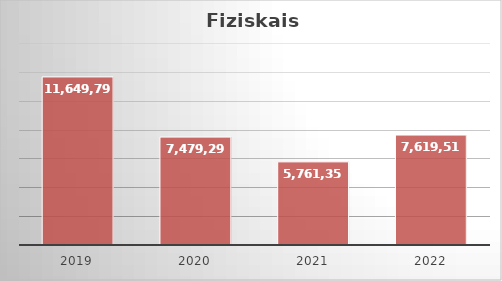
| Category | Series 0 |
|---|---|
| 2019 | 11649799 |
| 2020 | 7479290 |
| 2021 | 5761351 |
| 2022 | 7619513 |